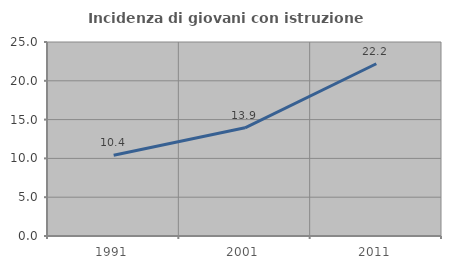
| Category | Incidenza di giovani con istruzione universitaria |
|---|---|
| 1991.0 | 10.398 |
| 2001.0 | 13.944 |
| 2011.0 | 22.199 |